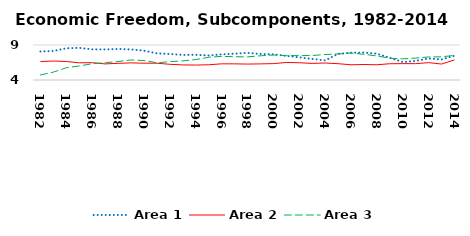
| Category | Area 1 | Area 2 | Area 3 |
|---|---|---|---|
| 1982.0 | 8.071 | 6.638 | 4.724 |
| 1983.0 | 8.15 | 6.71 | 5.129 |
| 1984.0 | 8.535 | 6.647 | 5.747 |
| 1985.0 | 8.591 | 6.458 | 6.015 |
| 1986.0 | 8.377 | 6.475 | 6.321 |
| 1987.0 | 8.37 | 6.298 | 6.474 |
| 1988.0 | 8.434 | 6.382 | 6.64 |
| 1989.0 | 8.366 | 6.446 | 6.861 |
| 1990.0 | 8.19 | 6.404 | 6.777 |
| 1991.0 | 7.809 | 6.399 | 6.466 |
| 1992.0 | 7.717 | 6.243 | 6.621 |
| 1993.0 | 7.582 | 6.156 | 6.729 |
| 1994.0 | 7.604 | 6.133 | 6.92 |
| 1995.0 | 7.499 | 6.176 | 7.243 |
| 1996.0 | 7.661 | 6.31 | 7.374 |
| 1997.0 | 7.764 | 6.306 | 7.329 |
| 1998.0 | 7.868 | 6.275 | 7.306 |
| 1999.0 | 7.723 | 6.302 | 7.458 |
| 2000.0 | 7.666 | 6.341 | 7.57 |
| 2001.0 | 7.451 | 6.503 | 7.481 |
| 2002.0 | 7.235 | 6.468 | 7.485 |
| 2003.0 | 7.016 | 6.372 | 7.495 |
| 2004.0 | 6.798 | 6.427 | 7.638 |
| 2005.0 | 7.73 | 6.329 | 7.725 |
| 2006.0 | 7.89 | 6.172 | 7.861 |
| 2007.0 | 7.924 | 6.214 | 7.673 |
| 2008.0 | 7.753 | 6.175 | 7.44 |
| 2009.0 | 7.165 | 6.325 | 7.113 |
| 2010.0 | 6.57 | 6.337 | 7.018 |
| 2011.0 | 6.725 | 6.333 | 7.134 |
| 2012.0 | 7.08 | 6.481 | 7.295 |
| 2013.0 | 6.923 | 6.278 | 7.307 |
| 2014.0 | 7.487 | 6.871 | 7.528 |